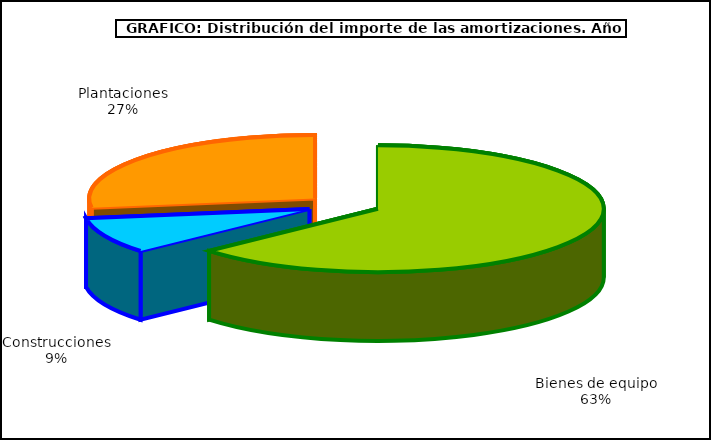
| Category | Series 0 |
|---|---|
| Bienes de equipo | 3301.276 |
| Construcciones | 479.109 |
| Plantaciones | 1423.093 |